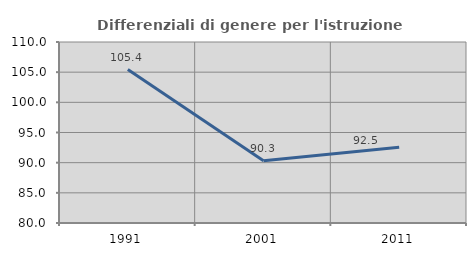
| Category | Differenziali di genere per l'istruzione superiore |
|---|---|
| 1991.0 | 105.432 |
| 2001.0 | 90.314 |
| 2011.0 | 92.547 |